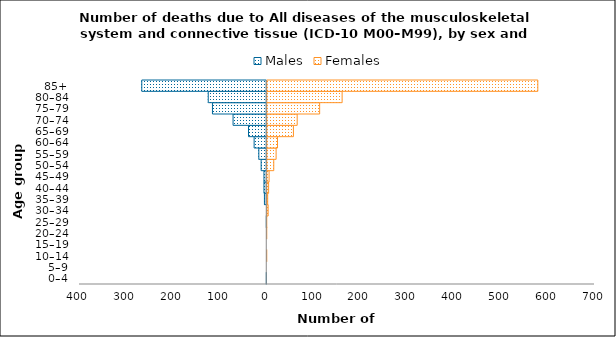
| Category | Males | Females |
|---|---|---|
| 0–4 | -1 | 0 |
| 5–9 | 0 | 0 |
| 10–14 | 0 | 1 |
| 15–19 | 0 | 0 |
| 20–24 | 0 | 1 |
| 25–29 | -1 | 1 |
| 30–34 | 0 | 4 |
| 35–39 | -5 | 3 |
| 40–44 | -6 | 5 |
| 45–49 | -6 | 6 |
| 50–54 | -12 | 16 |
| 55–59 | -17 | 21 |
| 60–64 | -27 | 24 |
| 65–69 | -39 | 58 |
| 70–74 | -72 | 66 |
| 75–79 | -116 | 114 |
| 80–84 | -125 | 162 |
| 85+ | -267 | 580 |